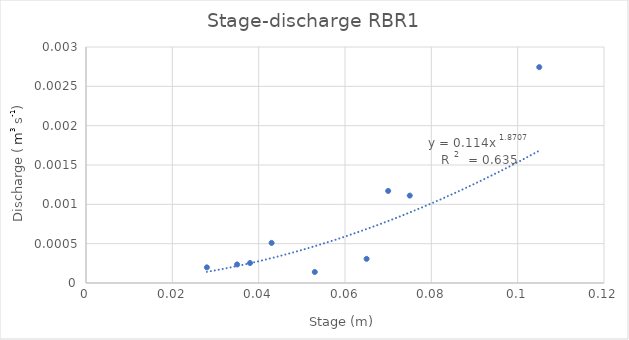
| Category | QA (m3/s) |
|---|---|
| 0.035 | 0 |
| 0.038 | 0 |
| 0.027999999999999997 | 0 |
| 0.07 | 0.001 |
| 0.065 | 0 |
| 0.105 | 0.003 |
| 0.053 | 0 |
| 0.075 | 0.001 |
| 0.043 | 0.001 |